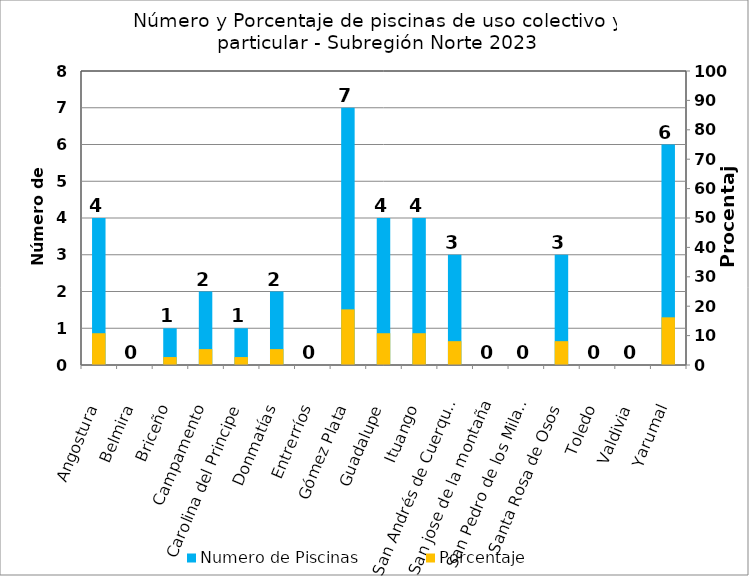
| Category | Numero de Piscinas |
|---|---|
| Angostura | 4 |
| Belmira | 0 |
| Briceño | 1 |
| Campamento | 2 |
| Carolina del Principe | 1 |
| Donmatías | 2 |
| Entrerríos | 0 |
| Gómez Plata | 7 |
| Guadalupe | 4 |
| Ituango | 4 |
| San Andrés de Cuerquia | 3 |
| San jose de la montaña | 0 |
| San Pedro de los Milagros | 0 |
| Santa Rosa de Osos | 3 |
| Toledo | 0 |
| Valdivia | 0 |
| Yarumal | 6 |